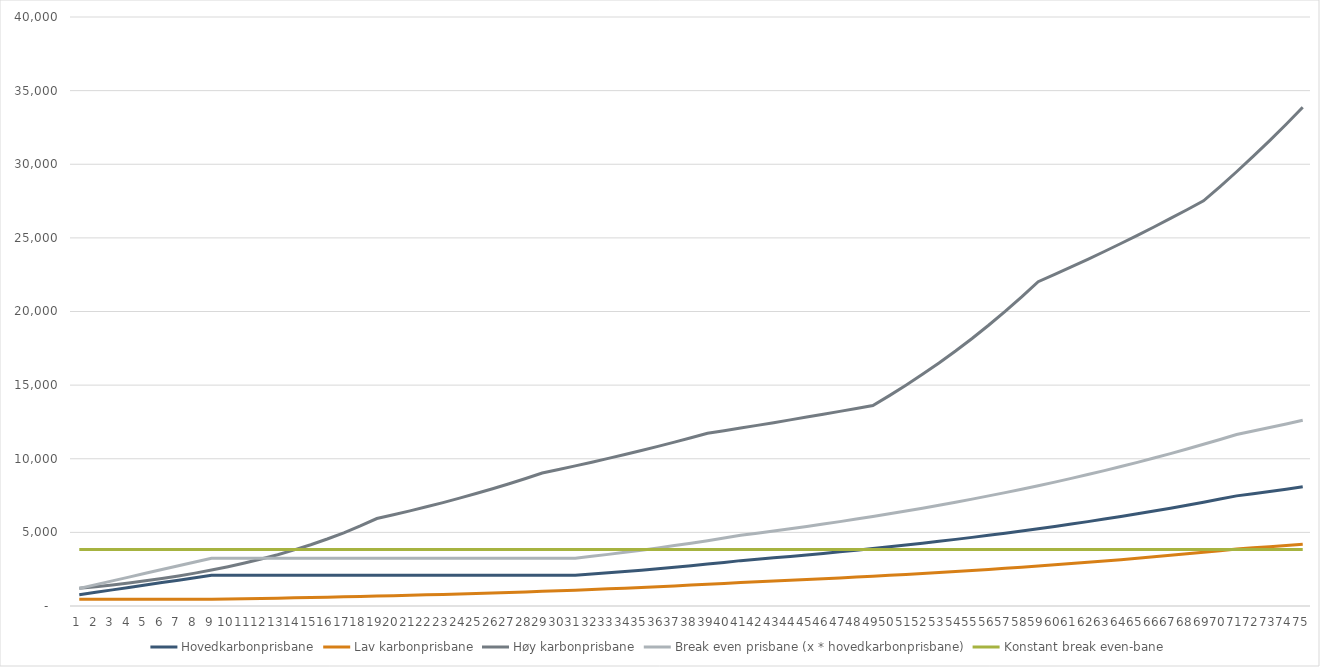
| Category | Hovedkarbonprisbane | Lav karbonprisbane | Høy karbonprisbane | Break even prisbane (x * hovedkarbonprisbane) | Konstant break even-bane |
|---|---|---|---|---|---|
| 0 | 766 | 461 | 1200 | 1193.204 | 3832.696 |
| 1 | 931 | 457 | 1311 | 1450.225 | 3832.696 |
| 2 | 1095 | 455 | 1433 | 1705.689 | 3832.696 |
| 3 | 1260 | 454 | 1566 | 1962.711 | 3832.696 |
| 4 | 1424 | 455 | 1711 | 2218.175 | 3832.696 |
| 5 | 1589 | 455 | 1870 | 2475.196 | 3832.696 |
| 6 | 1754 | 455 | 2044 | 2732.218 | 3832.696 |
| 7 | 1918 | 455 | 2233 | 2987.682 | 3832.696 |
| 8 | 2083 | 455 | 2441 | 3244.704 | 3832.696 |
| 9 | 2083 | 473 | 2668 | 3244.704 | 3832.696 |
| 10 | 2083 | 492 | 2916 | 3244.704 | 3832.696 |
| 11 | 2083 | 511 | 3187 | 3244.704 | 3832.696 |
| 12 | 2083 | 532 | 3484 | 3244.704 | 3832.696 |
| 13 | 2083 | 553 | 3808 | 3244.704 | 3832.696 |
| 14 | 2083 | 575 | 4162 | 3244.704 | 3832.696 |
| 15 | 2083 | 598 | 4549 | 3244.704 | 3832.696 |
| 16 | 2083 | 622 | 4972 | 3244.704 | 3832.696 |
| 17 | 2083 | 647 | 5435 | 3244.704 | 3832.696 |
| 18 | 2083 | 673 | 5940 | 3244.704 | 3832.696 |
| 19 | 2083 | 700 | 6194 | 3244.704 | 3832.696 |
| 20 | 2083 | 728 | 6459 | 3244.704 | 3832.696 |
| 21 | 2083 | 757 | 6735 | 3244.704 | 3832.696 |
| 22 | 2083 | 787 | 7023 | 3244.704 | 3832.696 |
| 23 | 2083 | 819 | 7323 | 3244.704 | 3832.696 |
| 24 | 2083 | 852 | 7636 | 3244.704 | 3832.696 |
| 25 | 2083 | 886 | 7963 | 3244.704 | 3832.696 |
| 26 | 2083 | 921 | 8304 | 3244.704 | 3832.696 |
| 27 | 2083 | 958 | 8659 | 3244.704 | 3832.696 |
| 28 | 2083 | 996 | 9029 | 3244.704 | 3832.696 |
| 29 | 2083 | 1036 | 9268 | 3244.704 | 3832.696 |
| 30 | 2083 | 1077 | 9514 | 3244.704 | 3832.696 |
| 31 | 2165 | 1121 | 9766 | 3372.436 | 3832.696 |
| 32 | 2251 | 1165 | 10025 | 3506.398 | 3832.696 |
| 33 | 2341 | 1212 | 10291 | 3646.592 | 3832.696 |
| 34 | 2435 | 1260 | 10563 | 3793.017 | 3832.696 |
| 35 | 2532 | 1311 | 10843 | 3944.114 | 3832.696 |
| 36 | 2634 | 1363 | 11131 | 4103 | 3832.696 |
| 37 | 2739 | 1418 | 11426 | 4266.559 | 3832.696 |
| 38 | 2848 | 1475 | 11729 | 4436.35 | 3832.696 |
| 39 | 2962 | 1534 | 11905 | 4613.928 | 3832.696 |
| 40 | 3081 | 1595 | 12085 | 4799.295 | 3832.696 |
| 41 | 3173 | 1643 | 12266 | 4942.604 | 3832.696 |
| 42 | 3269 | 1692 | 12451 | 5092.144 | 3832.696 |
| 43 | 3367 | 1743 | 12639 | 5244.799 | 3832.696 |
| 44 | 3468 | 1795 | 12829 | 5402.128 | 3832.696 |
| 45 | 3572 | 1849 | 13022 | 5564.129 | 3832.696 |
| 46 | 3679 | 1904 | 13218 | 5730.804 | 3832.696 |
| 47 | 3789 | 1962 | 13417 | 5902.152 | 3832.696 |
| 48 | 3903 | 2020 | 13619 | 6079.73 | 3832.696 |
| 49 | 4020 | 2081 | 14289 | 6261.982 | 3832.696 |
| 50 | 4140 | 2143 | 14993 | 6448.907 | 3832.696 |
| 51 | 4265 | 2208 | 15731 | 6643.62 | 3832.696 |
| 52 | 4393 | 2274 | 16505 | 6843.007 | 3832.696 |
| 53 | 4524 | 2342 | 17318 | 7047.067 | 3832.696 |
| 54 | 4660 | 2412 | 18170 | 7258.915 | 3832.696 |
| 55 | 4800 | 2485 | 19065 | 7476.994 | 3832.696 |
| 56 | 4944 | 2559 | 20003 | 7701.303 | 3832.696 |
| 57 | 5092 | 2636 | 20988 | 7931.844 | 3832.696 |
| 58 | 5245 | 2715 | 22021 | 8170.173 | 3832.696 |
| 59 | 5402 | 2797 | 22517 | 8414.733 | 3832.696 |
| 60 | 5564 | 2881 | 23025 | 8667.082 | 3832.696 |
| 61 | 5731 | 2967 | 23544 | 8927.219 | 3832.696 |
| 62 | 5903 | 3056 | 24074 | 9195.144 | 3832.696 |
| 63 | 6080 | 3148 | 24617 | 9470.859 | 3832.696 |
| 64 | 6263 | 3242 | 25172 | 9755.919 | 3832.696 |
| 65 | 6451 | 3339 | 25739 | 10048.768 | 3832.696 |
| 66 | 6644 | 3440 | 26319 | 10349.405 | 3832.696 |
| 67 | 6844 | 3543 | 26912 | 10660.947 | 3832.696 |
| 68 | 7049 | 3649 | 27518 | 10980.277 | 3832.696 |
| 69 | 7260 | 3759 | 28488 | 11308.953 | 3832.696 |
| 70 | 7478 | 3871 | 29491 | 11648.533 | 3832.696 |
| 71 | 7628 | 3949 | 30530 | 11882.189 | 3832.696 |
| 72 | 7780 | 4028 | 31605 | 12118.961 | 3832.696 |
| 73 | 7936 | 4108 | 32719 | 12361.963 | 3832.696 |
| 74 | 8095 | 4190 | 33871 | 12609.638 | 3832.696 |